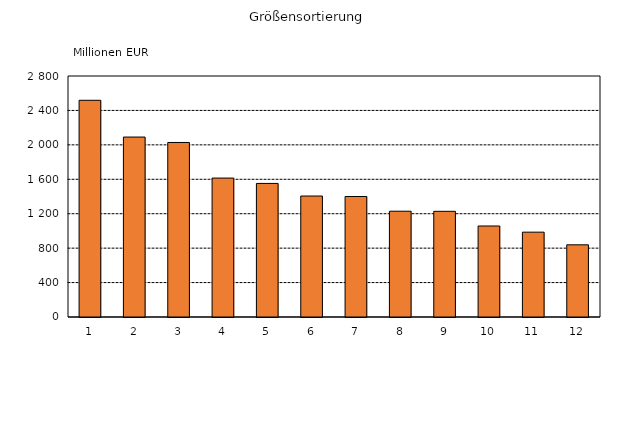
| Category | Series 0 |
|---|---|
| 1 | 2517.764 |
| 2 | 2090.561 |
| 3 | 2027.714 |
| 4 | 1614.187 |
| 5 | 1551.867 |
| 6 | 1405.51 |
| 7 | 1399.992 |
| 8 | 1229.129 |
| 9 | 1227.805 |
| 10 | 1057.389 |
| 11 | 985.714 |
| 12 | 838.533 |